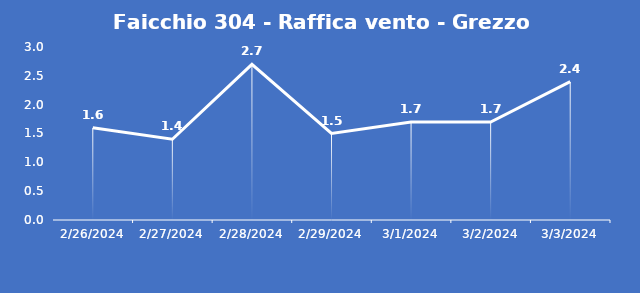
| Category | Faicchio 304 - Raffica vento - Grezzo (m/s) |
|---|---|
| 2/26/24 | 1.6 |
| 2/27/24 | 1.4 |
| 2/28/24 | 2.7 |
| 2/29/24 | 1.5 |
| 3/1/24 | 1.7 |
| 3/2/24 | 1.7 |
| 3/3/24 | 2.4 |